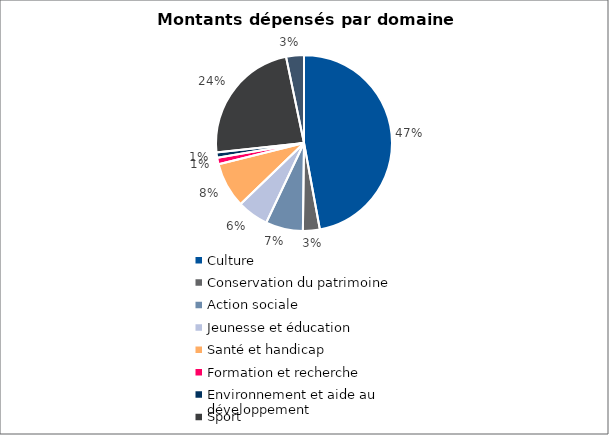
| Category | Series 0 |
|---|---|
| Culture | 23531800 |
| Conservation du patrimoine | 1544500 |
| Action sociale | 3416700 |
| Jeunesse et éducation | 2872100 |
| Santé et handicap | 4162510 |
| Formation et recherche | 600000 |
| Environnement et aide au
développement | 483000 |
| Sport | 11707480 |
| Autres projets d’utilité publique | 1634000 |